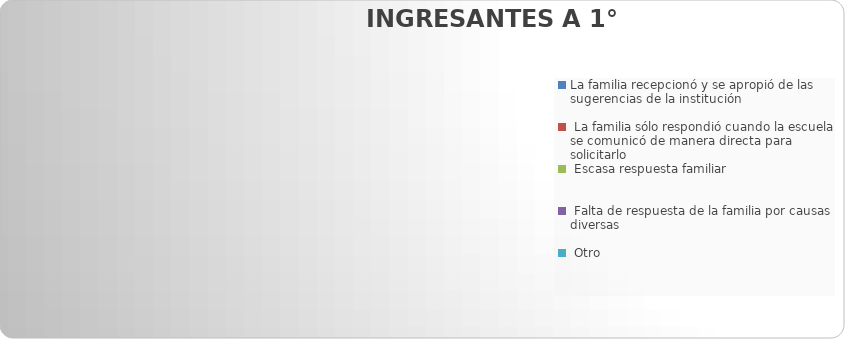
| Category | La familia recepcionó y se apropió de las sugerencias de la institución |
|---|---|
| La familia recepcionó y se apropió de las sugerencias de la institución | 0 |
|  La familia sólo respondió cuando la escuela se comunicó de manera directa para solicitarlo | 0 |
|  Escasa respuesta familiar | 0 |
|  Falta de respuesta de la familia por causas diversas | 0 |
|  Otro  | 0 |